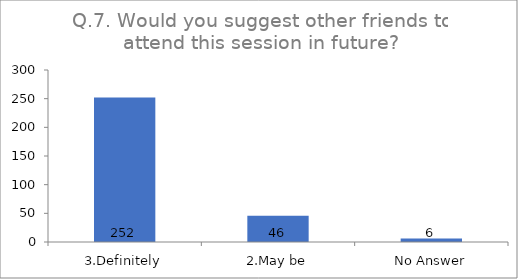
| Category | Q.7. Would you suggest other friends to attend this session in future? |
|---|---|
| 3.Definitely | 252 |
| 2.May be | 46 |
| No Answer | 6 |